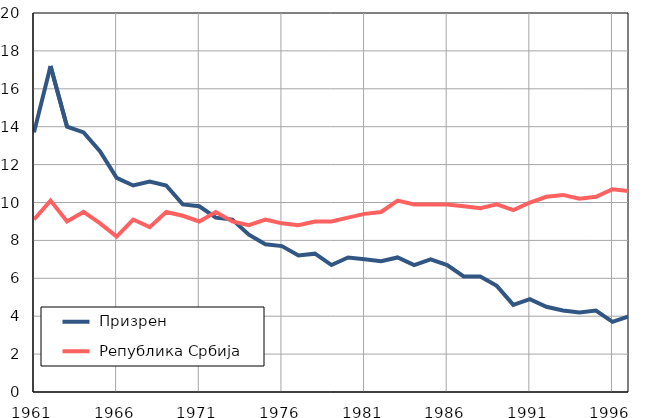
| Category |  Призрен |  Република Србија |
|---|---|---|
| 1961.0 | 13.7 | 9.1 |
| 1962.0 | 17.2 | 10.1 |
| 1963.0 | 14 | 9 |
| 1964.0 | 13.7 | 9.5 |
| 1965.0 | 12.7 | 8.9 |
| 1966.0 | 11.3 | 8.2 |
| 1967.0 | 10.9 | 9.1 |
| 1968.0 | 11.1 | 8.7 |
| 1969.0 | 10.9 | 9.5 |
| 1970.0 | 9.9 | 9.3 |
| 1971.0 | 9.8 | 9 |
| 1972.0 | 9.2 | 9.5 |
| 1973.0 | 9.1 | 9 |
| 1974.0 | 8.3 | 8.8 |
| 1975.0 | 7.8 | 9.1 |
| 1976.0 | 7.7 | 8.9 |
| 1977.0 | 7.2 | 8.8 |
| 1978.0 | 7.3 | 9 |
| 1979.0 | 6.7 | 9 |
| 1980.0 | 7.1 | 9.2 |
| 1981.0 | 7 | 9.4 |
| 1982.0 | 6.9 | 9.5 |
| 1983.0 | 7.1 | 10.1 |
| 1984.0 | 6.7 | 9.9 |
| 1985.0 | 7 | 9.9 |
| 1986.0 | 6.7 | 9.9 |
| 1987.0 | 6.1 | 9.8 |
| 1988.0 | 6.1 | 9.7 |
| 1989.0 | 5.6 | 9.9 |
| 1990.0 | 4.6 | 9.6 |
| 1991.0 | 4.9 | 10 |
| 1992.0 | 4.5 | 10.3 |
| 1993.0 | 4.3 | 10.4 |
| 1994.0 | 4.2 | 10.2 |
| 1995.0 | 4.3 | 10.3 |
| 1996.0 | 3.7 | 10.7 |
| 1997.0 | 4 | 10.6 |